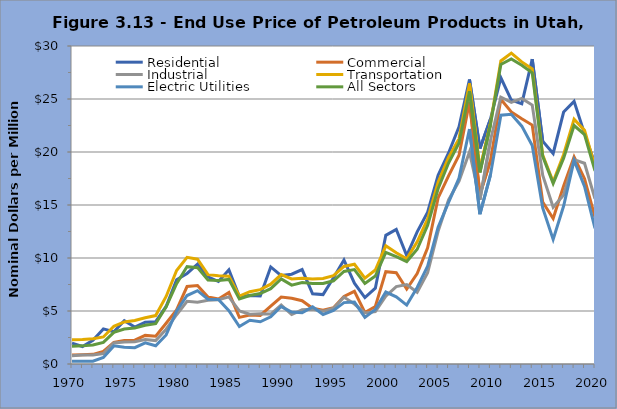
| Category | Residential | Commercial | Industrial | Transportation | Electric Utilities | All Sectors |
|---|---|---|---|---|---|---|
| 1970.0 | 1.97 | 0.86 | 0.77 | 2.28 | 0.26 | 1.68 |
| 1971.0 | 1.65 | 0.88 | 0.84 | 2.32 | 0.26 | 1.71 |
| 1972.0 | 2.23 | 0.91 | 0.85 | 2.39 | 0.27 | 1.8 |
| 1973.0 | 3.31 | 1.18 | 0.98 | 2.55 | 0.62 | 2.04 |
| 1974.0 | 3.04 | 2.04 | 1.99 | 3.56 | 1.71 | 2.99 |
| 1975.0 | 4.09 | 2.22 | 2.08 | 3.97 | 1.59 | 3.3 |
| 1976.0 | 3.48 | 2.25 | 2.11 | 4.11 | 1.54 | 3.39 |
| 1977.0 | 3.94 | 2.7 | 2.32 | 4.37 | 1.99 | 3.65 |
| 1978.0 | 3.99 | 2.63 | 2.21 | 4.57 | 1.72 | 3.8 |
| 1979.0 | 5.43 | 3.85 | 3.28 | 6.37 | 2.74 | 5.4 |
| 1980.0 | 7.95 | 5.11 | 4.65 | 8.82 | 5 | 7.58 |
| 1981.0 | 8.54 | 7.31 | 5.92 | 10.06 | 6.46 | 9.19 |
| 1982.0 | 9.43 | 7.41 | 5.83 | 9.89 | 6.92 | 9.09 |
| 1983.0 | 8.23 | 6.32 | 6.02 | 8.43 | 6.11 | 7.93 |
| 1984.0 | 7.78 | 6.14 | 6.06 | 8.32 | 6.09 | 7.88 |
| 1985.0 | 8.88 | 6.74 | 6.33 | 8.29 | 5.02 | 7.98 |
| 1986.0 | 6.36 | 4.4 | 5 | 6.41 | 3.54 | 6.13 |
| 1987.0 | 6.47 | 4.62 | 4.7 | 6.82 | 4.12 | 6.46 |
| 1988.0 | 6.41 | 4.58 | 4.74 | 7.01 | 3.98 | 6.65 |
| 1989.0 | 9.16 | 5.45 | 4.71 | 7.53 | 4.45 | 7.11 |
| 1990.0 | 8.34 | 6.32 | 5.56 | 8.44 | 5.42 | 8.03 |
| 1991.0 | 8.47 | 6.21 | 4.67 | 8.02 | 4.9 | 7.44 |
| 1992.0 | 8.91 | 5.97 | 5.11 | 8.1 | 4.84 | 7.69 |
| 1993.0 | 6.62 | 5.26 | 5.17 | 8.02 | 5.39 | 7.59 |
| 1994.0 | 6.55 | 5.07 | 4.97 | 8.06 | 4.67 | 7.6 |
| 1995.0 | 8.14 | 5.31 | 5.26 | 8.33 | 5.05 | 7.85 |
| 1996.0 | 9.82 | 6.38 | 6.31 | 9.2 | 5.79 | 8.73 |
| 1997.0 | 7.62 | 6.86 | 5.66 | 9.41 | 5.84 | 8.91 |
| 1998.0 | 6.27 | 4.86 | 4.82 | 8.1 | 4.4 | 7.6 |
| 1999.0 | 7.15 | 5.42 | 4.94 | 8.87 | 5.14 | 8.3 |
| 2000.0 | 12.14 | 8.71 | 6.4 | 11.15 | 6.79 | 10.53 |
| 2001.0 | 12.69 | 8.61 | 7.3 | 10.5 | 6.34 | 10.12 |
| 2002.0 | 10.23 | 7.07 | 7.5 | 9.92 | 5.56 | 9.66 |
| 2003.0 | 12.47 | 8.54 | 6.77 | 11.53 | 7.22 | 10.82 |
| 2004.0 | 14.32 | 10.97 | 8.61 | 13.68 | 9.24 | 13.08 |
| 2005.0 | 17.8 | 15.67 | 12.52 | 17.15 | 12.91 | 16.53 |
| 2006.0 | 19.91 | 17.75 | 15.48 | 19.48 | 15.25 | 18.96 |
| 2007.0 | 22.38 | 19.69 | 17.25 | 21.26 | 17.53 | 20.85 |
| 2008.0 | 26.84 | 24.73 | 20.01 | 26.47 | 22.17 | 25.73 |
| 2009.0 | 20.34 | 16.02 | 15.5 | 18.36 | 14.13 | 18.08 |
| 2010.0 | 23.09 | 19.16 | 21.09 | 22.65 | 17.81 | 22.54 |
| 2011.0 | 27 | 24.97 | 25.18 | 28.59 | 23.47 | 28.26 |
| 2012.0 | 24.9 | 23.78 | 24.68 | 29.33 | 23.55 | 28.78 |
| 2013.0 | 24.55 | 23.13 | 25.05 | 28.5 | 22.44 | 28.19 |
| 2014.0 | 28.76 | 22.54 | 24.43 | 27.84 | 20.61 | 27.48 |
| 2015.0 | 21.02 | 15.29 | 17.81 | 19.72 | 14.72 | 19.59 |
| 2016.0 | 19.86 | 13.72 | 14.78 | 17.18 | 11.75 | 17.04 |
| 2017.0 | 23.77 | 16.79 | 15.95 | 19.76 | 14.9 | 19.42 |
| 2018.0 | 24.78 | 19.54 | 19.28 | 23.1 | 19.21 | 22.5 |
| 2019.0 | 21.73 | 17.48 | 18.94 | 22.04 | 16.75 | 21.64 |
| 2020.0 | 18.86 | 13.84 | 15.59 | 18.66 | 12.8 | 18.22 |